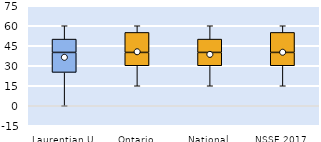
| Category | 25th | 50th | 75th |
|---|---|---|---|
| Laurentian U | 25 | 15 | 10 |
| Ontario | 30 | 10 | 15 |
| National | 30 | 10 | 10 |
| NSSE 2017 | 30 | 10 | 15 |